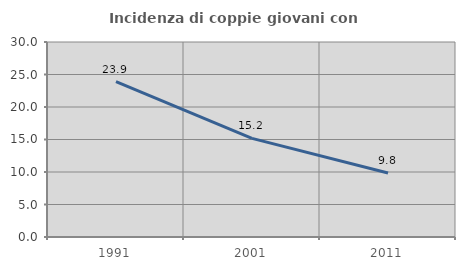
| Category | Incidenza di coppie giovani con figli |
|---|---|
| 1991.0 | 23.915 |
| 2001.0 | 15.175 |
| 2011.0 | 9.843 |